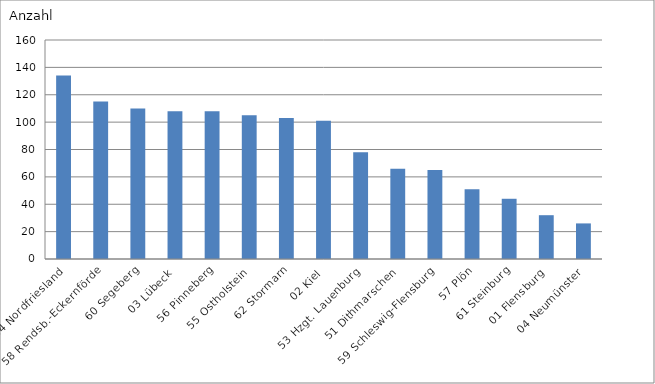
| Category | 54 Nordfriesland |
|---|---|
| 54 Nordfriesland | 134 |
| 58 Rendsb.-Eckernförde | 115 |
| 60 Segeberg | 110 |
| 03 Lübeck | 108 |
| 56 Pinneberg | 108 |
| 55 Ostholstein | 105 |
| 62 Stormarn | 103 |
| 02 Kiel | 101 |
| 53 Hzgt. Lauenburg | 78 |
| 51 Dithmarschen | 66 |
| 59 Schleswig-Flensburg | 65 |
| 57 Plön | 51 |
| 61 Steinburg | 44 |
| 01 Flensburg | 32 |
| 04 Neumünster | 26 |